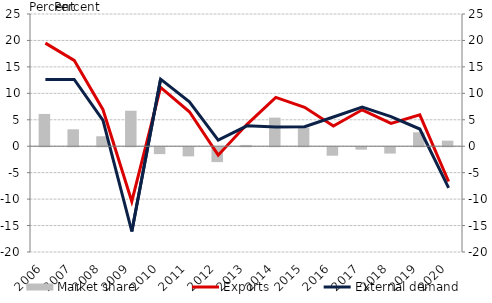
| Category | Market share |
|---|---|
| 2006.0 | 6.105 |
| 2007.0 | 3.196 |
| 2008.0 | 1.885 |
| 2009.0 | 6.713 |
| 2010.0 | -1.308 |
| 2011.0 | -1.728 |
| 2012.0 | -2.817 |
| 2013.0 | 0.241 |
| 2014.0 | 5.407 |
| 2015.0 | 3.529 |
| 2016.0 | -1.605 |
| 2017.0 | -0.463 |
| 2018.0 | -1.203 |
| 2019.0 | 2.629 |
| 2020.0 | 1.052 |